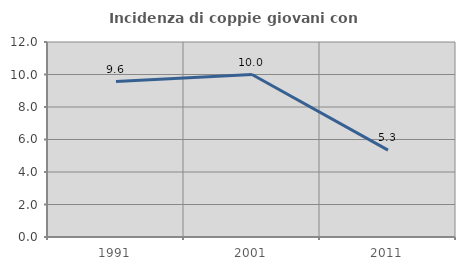
| Category | Incidenza di coppie giovani con figli |
|---|---|
| 1991.0 | 9.565 |
| 2001.0 | 10 |
| 2011.0 | 5.344 |